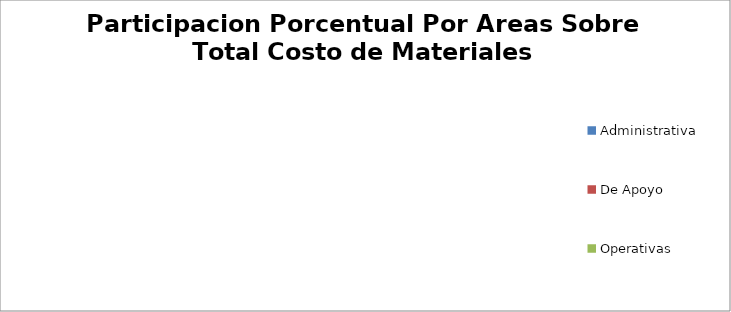
| Category | Participacion Porcentual Por Areas Sobre Total Costo de Materiales |
|---|---|
| Administrativa | 0 |
| De Apoyo | 0 |
| Operativas | 0 |